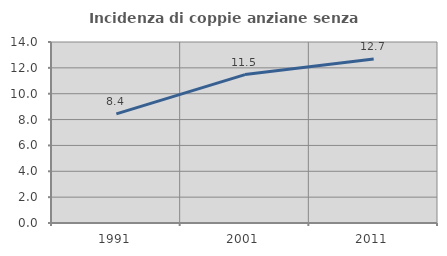
| Category | Incidenza di coppie anziane senza figli  |
|---|---|
| 1991.0 | 8.438 |
| 2001.0 | 11.478 |
| 2011.0 | 12.681 |